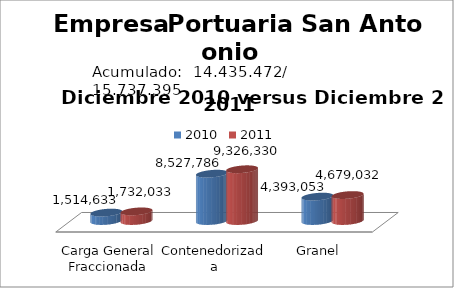
| Category | 2010 | 2011 |
|---|---|---|
| Carga General Fraccionada | 1514632.93 | 1732032.92 |
| Contenedorizada | 8527785.6 | 9326330.4 |
| Granel | 4393053.21 | 4679031.71 |